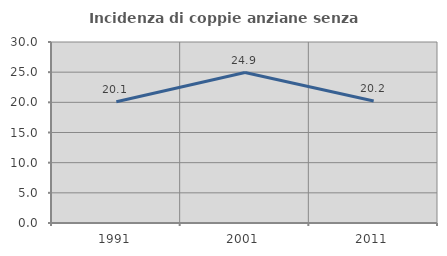
| Category | Incidenza di coppie anziane senza figli  |
|---|---|
| 1991.0 | 20.099 |
| 2001.0 | 24.932 |
| 2011.0 | 20.217 |